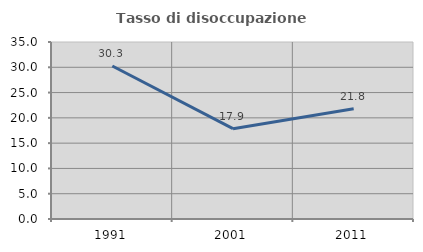
| Category | Tasso di disoccupazione giovanile  |
|---|---|
| 1991.0 | 30.252 |
| 2001.0 | 17.857 |
| 2011.0 | 21.805 |